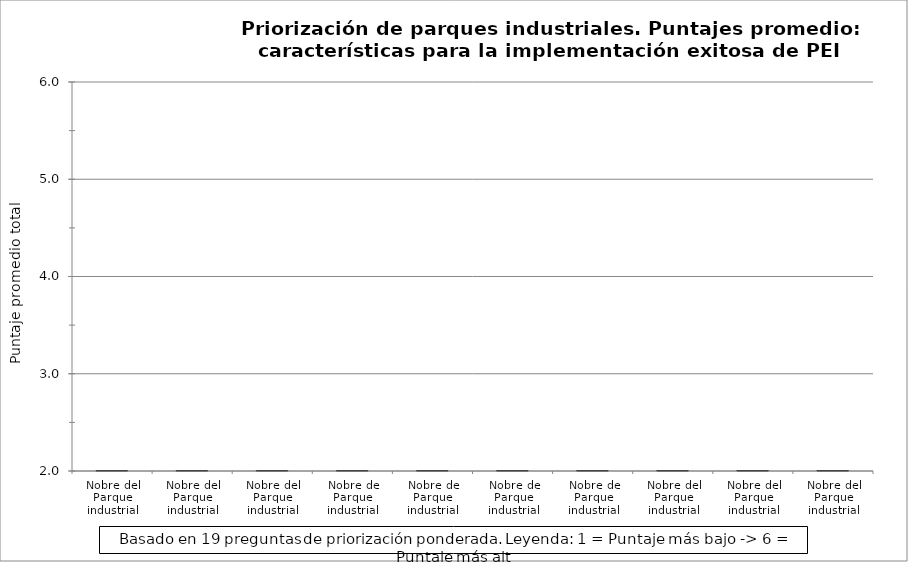
| Category | Series 0 |
|---|---|
| Nobre del Parque industrial | 0 |
| Nobre del Parque industrial | 0 |
| Nobre del Parque industrial | 0 |
| Nobre de Parque industrial | 0 |
| Nobre de Parque industrial | 0 |
| Nobre de Parque industrial | 0 |
| Nobre de Parque industrial | 0 |
| Nobre del Parque industrial | 0 |
| Nobre del Parque industrial | 0 |
| Nobre del Parque industrial | 0 |